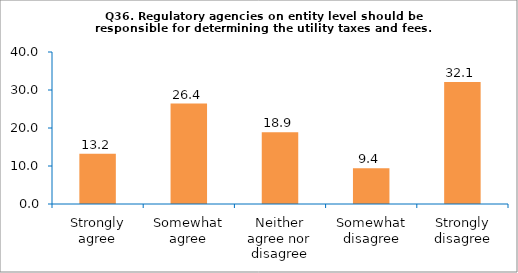
| Category | Series 0 |
|---|---|
| Strongly agree | 13.208 |
| Somewhat agree | 26.415 |
| Neither agree nor disagree | 18.868 |
| Somewhat disagree | 9.434 |
| Strongly disagree | 32.075 |